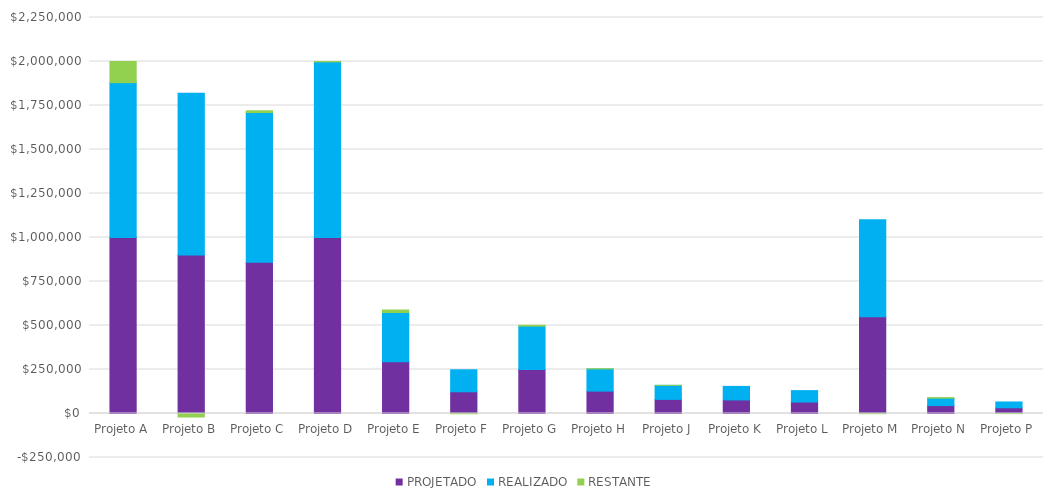
| Category | PROJETADO | REALIZADO | RESTANTE |
|---|---|---|---|
| Projeto A | 1000000 | 880000 | 120000 |
| Projeto B | 900000 | 920000 | -20000 |
| Projeto C | 860000 | 850000 | 10000 |
| Projeto D | 1000000 | 998050 | 1950 |
| Projeto E | 294000 | 280000 | 14000 |
| Projeto F | 123400 | 125000 | -1600 |
| Projeto G | 250500 | 246000 | 4500 |
| Projeto H | 127200 | 126000 | 1200 |
| Projeto J | 80000 | 79900 | 100 |
| Projeto K | 77000 | 77000 | 0 |
| Projeto L | 65000 | 65000 | 0 |
| Projeto M | 550000 | 551000 | -1000 |
| Projeto N | 45000 | 42000 | 3000 |
| Projeto P | 32500 | 33000 | -500 |